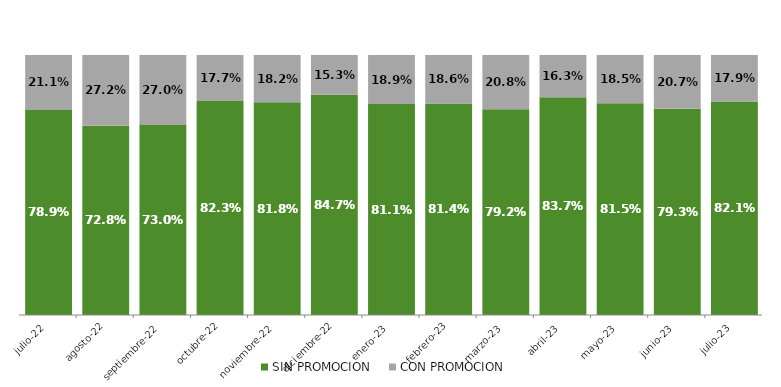
| Category | SIN PROMOCION   | CON PROMOCION   |
|---|---|---|
| 2022-07-01 | 0.789 | 0.211 |
| 2022-08-01 | 0.728 | 0.272 |
| 2022-09-01 | 0.73 | 0.27 |
| 2022-10-01 | 0.823 | 0.177 |
| 2022-11-01 | 0.818 | 0.182 |
| 2022-12-01 | 0.847 | 0.153 |
| 2023-01-01 | 0.811 | 0.189 |
| 2023-02-01 | 0.814 | 0.186 |
| 2023-03-01 | 0.792 | 0.208 |
| 2023-04-01 | 0.837 | 0.163 |
| 2023-05-01 | 0.815 | 0.185 |
| 2023-06-01 | 0.793 | 0.207 |
| 2023-07-01 | 0.821 | 0.179 |